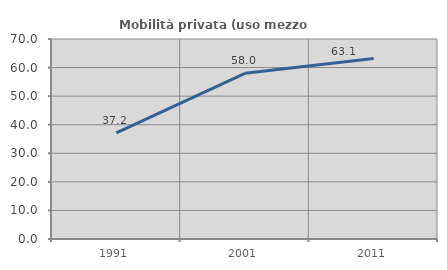
| Category | Mobilità privata (uso mezzo privato) |
|---|---|
| 1991.0 | 37.159 |
| 2001.0 | 57.993 |
| 2011.0 | 63.142 |